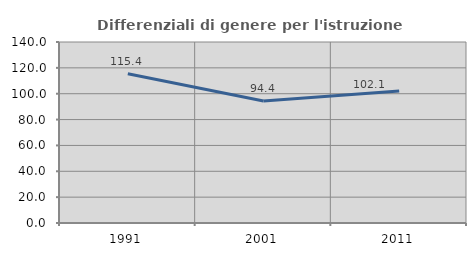
| Category | Differenziali di genere per l'istruzione superiore |
|---|---|
| 1991.0 | 115.406 |
| 2001.0 | 94.414 |
| 2011.0 | 102.064 |